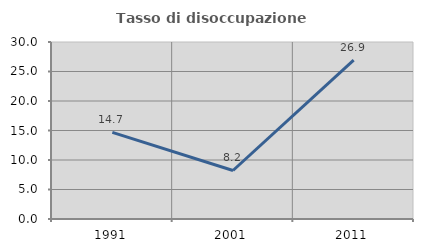
| Category | Tasso di disoccupazione giovanile  |
|---|---|
| 1991.0 | 14.673 |
| 2001.0 | 8.223 |
| 2011.0 | 26.912 |